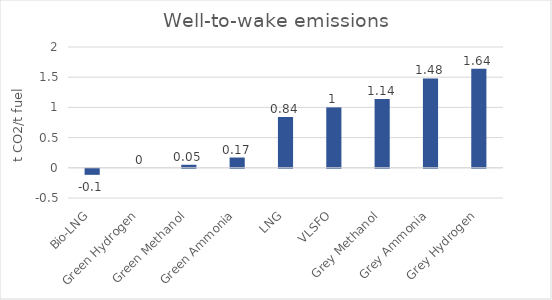
| Category | Series 0 |
|---|---|
| Bio-LNG | -0.1 |
| Green Hydrogen | 0 |
| Green Methanol | 0.05 |
| Green Ammonia | 0.17 |
| LNG | 0.84 |
| VLSFO | 1 |
| Grey Methanol | 1.14 |
| Grey Ammonia | 1.48 |
| Grey Hydrogen | 1.64 |